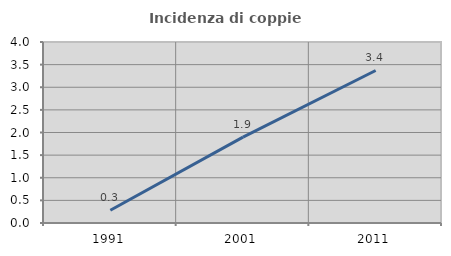
| Category | Incidenza di coppie miste |
|---|---|
| 1991.0 | 0.281 |
| 2001.0 | 1.899 |
| 2011.0 | 3.371 |